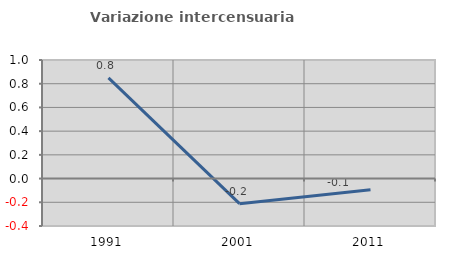
| Category | Variazione intercensuaria annua |
|---|---|
| 1991.0 | 0.85 |
| 2001.0 | -0.212 |
| 2011.0 | -0.093 |